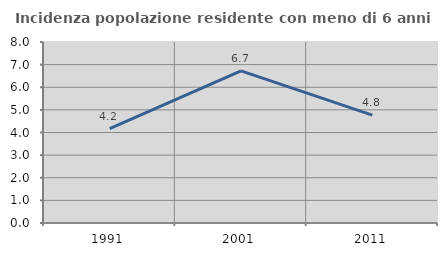
| Category | Incidenza popolazione residente con meno di 6 anni |
|---|---|
| 1991.0 | 4.175 |
| 2001.0 | 6.721 |
| 2011.0 | 4.771 |